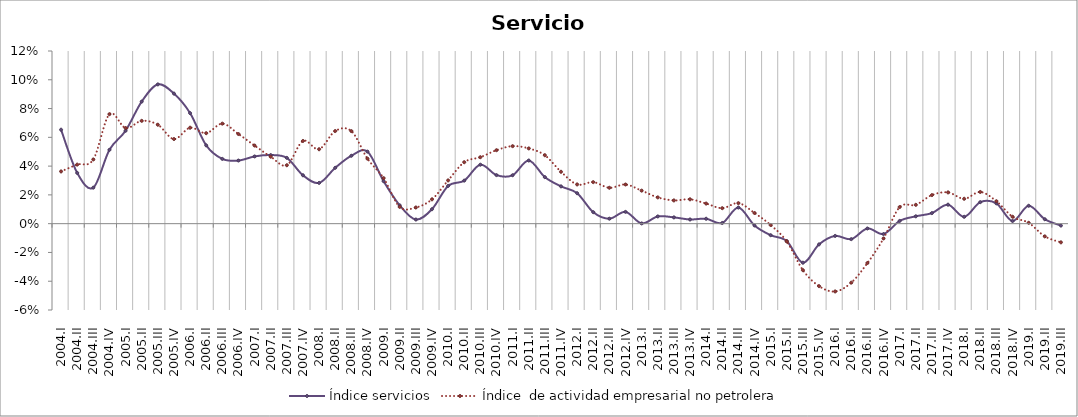
| Category | Índice servicios | Índice  de actividad empresarial no petrolera |
|---|---|---|
| 2004.I | 0.065 | 0.036 |
| 2004.II | 0.035 | 0.041 |
| 2004.III | 0.025 | 0.045 |
| 2004.IV | 0.051 | 0.076 |
| 2005.I | 0.065 | 0.066 |
| 2005.II | 0.085 | 0.071 |
| 2005.III | 0.097 | 0.069 |
| 2005.IV | 0.09 | 0.059 |
| 2006.I | 0.077 | 0.067 |
| 2006.II | 0.054 | 0.063 |
| 2006.III | 0.045 | 0.07 |
| 2006.IV | 0.044 | 0.062 |
| 2007.I | 0.047 | 0.054 |
| 2007.II | 0.048 | 0.047 |
| 2007.III | 0.046 | 0.041 |
| 2007.IV | 0.034 | 0.057 |
| 2008.I | 0.028 | 0.052 |
| 2008.II | 0.039 | 0.064 |
| 2008.III | 0.047 | 0.064 |
| 2008.IV | 0.05 | 0.045 |
| 2009.I | 0.03 | 0.032 |
| 2009.II | 0.013 | 0.012 |
| 2009.III | 0.003 | 0.011 |
| 2009.IV | 0.01 | 0.017 |
| 2010.I | 0.026 | 0.03 |
| 2010.II | 0.03 | 0.043 |
| 2010.III | 0.041 | 0.046 |
| 2010.IV | 0.034 | 0.051 |
| 2011.I | 0.034 | 0.054 |
| 2011.II | 0.044 | 0.052 |
| 2011.III | 0.032 | 0.048 |
| 2011.IV | 0.026 | 0.036 |
| 2012.I | 0.021 | 0.027 |
| 2012.II | 0.008 | 0.029 |
| 2012.III | 0.003 | 0.025 |
| 2012.IV | 0.008 | 0.027 |
| 2013.I | 0 | 0.023 |
| 2013.II | 0.005 | 0.018 |
| 2013.III | 0.004 | 0.016 |
| 2013.IV | 0.003 | 0.017 |
| 2014.I | 0.003 | 0.014 |
| 2014.II | 0 | 0.011 |
| 2014.III | 0.011 | 0.014 |
| 2014.IV | -0.001 | 0.007 |
| 2015.I | -0.008 | -0.001 |
| 2015.II | -0.012 | -0.012 |
| 2015.III | -0.027 | -0.032 |
| 2015.IV | -0.014 | -0.043 |
| 2016.I | -0.009 | -0.047 |
| 2016.II | -0.011 | -0.041 |
| 2016.III | -0.003 | -0.027 |
| 2016.IV | -0.007 | -0.01 |
| 2017.I | 0.002 | 0.012 |
| 2017.II | 0.005 | 0.013 |
| 2017.III | 0.007 | 0.02 |
| 2017.IV | 0.013 | 0.022 |
| 2018.I | 0.005 | 0.017 |
| 2018.II | 0.015 | 0.022 |
| 2018.III | 0.014 | 0.016 |
| 2018.IV | 0.002 | 0.005 |
| 2019.I | 0.012 | 0.001 |
| 2019.II | 0.003 | -0.009 |
| 2019.III | -0.001 | -0.013 |